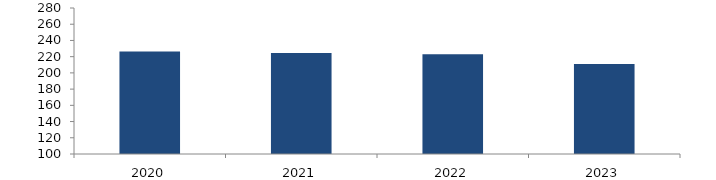
| Category | Bogotá |
|---|---|
| 2020.0 | 226.511 |
| 2021.0 | 224.583 |
| 2022.0 | 223.126 |
| 2023.0 | 210.859 |